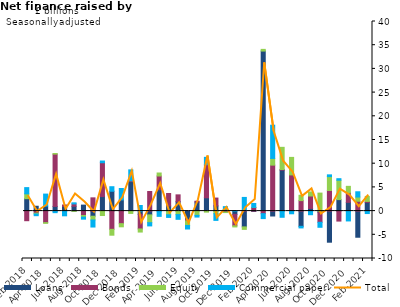
| Category | Loans | Bonds | Equity | Commercial paper |
|---|---|---|---|---|
| Feb-2018 | 2.622 | -2.027 | 1.023 | 1.309 |
| Mar-2018 | 1.023 | -0.433 | -0.179 | -0.357 |
| Apr-2018 | 1.059 | -2.435 | -0.149 | 2.532 |
| May-2018 | 0.992 | 11.031 | 0.129 | -0.33 |
| Jun-2018 | 0.997 | 0.294 | -0.016 | -0.977 |
| Jul-2018 | 1.021 | 0.494 | -0.045 | 0.233 |
| Aug-2018 | 1.263 | -0.932 | -0.336 | -0.431 |
| Sep-2018 | -1.081 | 2.795 | -0.796 | -1.484 |
| Oct-2018 | 3.065 | 7.138 | -0.937 | 0.363 |
| Nov-2018 | 4.187 | -3.846 | -1.236 | 0.958 |
| Dec-2018 | 2.359 | -2.65 | -0.666 | 2.407 |
| Jan-2019 | 6.224 | 0.161 | -0.492 | 2.312 |
| Feb-2019 | -0.682 | -3.084 | -0.655 | 1.181 |
| Mar-2019 | -0.797 | 4.131 | -1.644 | -0.683 |
| Apr-2019 | 4.489 | 2.92 | 0.629 | -1.109 |
| May-2019 | 1.092 | 2.622 | -0.774 | -0.561 |
| Jun-2019 | 1.99 | 1.437 | -0.733 | -1.001 |
| Jul-2019 | -1.794 | -0.281 | -0.959 | -0.742 |
| Aug-2019 | 1.912 | 0.174 | -0.899 | -0.357 |
| Sep-2019 | 2.811 | 6.981 | -0.216 | 1.548 |
| Oct-2019 | 1.099 | 1.651 | -0.544 | -1.416 |
| Nov-2019 | 0.288 | -0.195 | -0.114 | 0.654 |
| Dec-2019 | -0.686 | -2.415 | -0.24 | 0.031 |
| Jan-2020 | -3.332 | 0.155 | -0.525 | 2.731 |
| Feb-2020 | -0.054 | 0.764 | 0.022 | 0.826 |
| Mar-2020 | 33.759 | -0.54 | 0.362 | -1.041 |
| Apr-2020 | -1.033 | 9.698 | 1.414 | 7.014 |
| May-2020 | 8.65 | 0.131 | 4.674 | -1.303 |
| Jun-2020 | 0.141 | 7.494 | 3.698 | -0.564 |
| Jul-2020 | -3.21 | 2.212 | 1.124 | -0.34 |
| Aug-2020 | 0.57 | 2.614 | 0.857 | -0.762 |
| Sep-2020 | -0.235 | -2.122 | 3.797 | -1.058 |
| Oct-2020 | -6.562 | 4.349 | 2.931 | 0.366 |
| Nov-2020 | 2.425 | -2.106 | 4.086 | 0.327 |
| Dec-2020 | 1.847 | 2.015 | 1.361 | -2.076 |
| Jan-2021 | -5.514 | 2.081 | 0.887 | 1.11 |
| Feb-2021 | 1.85 | 0.193 | 1.061 | -0.517 |